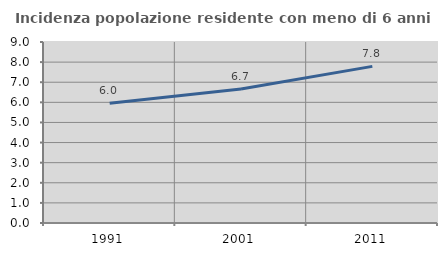
| Category | Incidenza popolazione residente con meno di 6 anni |
|---|---|
| 1991.0 | 5.958 |
| 2001.0 | 6.667 |
| 2011.0 | 7.788 |